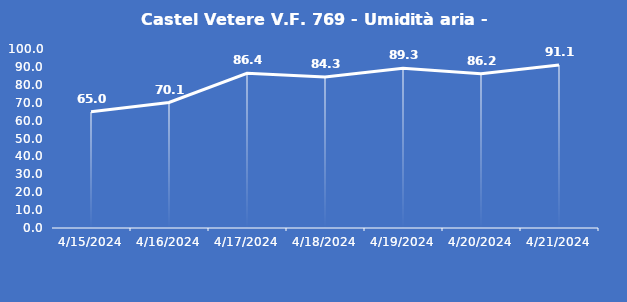
| Category | Castel Vetere V.F. 769 - Umidità aria - Grezzo (%) |
|---|---|
| 4/15/24 | 65 |
| 4/16/24 | 70.1 |
| 4/17/24 | 86.4 |
| 4/18/24 | 84.3 |
| 4/19/24 | 89.3 |
| 4/20/24 | 86.2 |
| 4/21/24 | 91.1 |